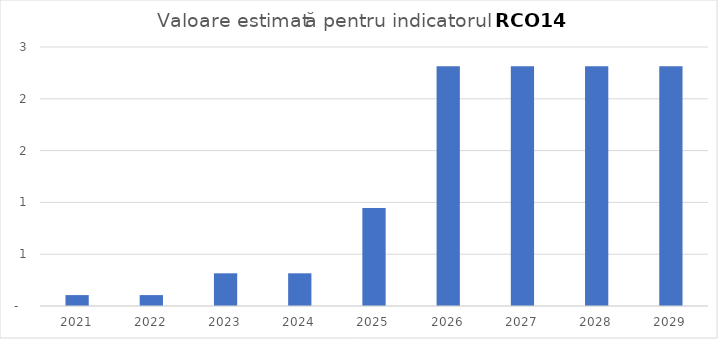
| Category | Series 0 |
|---|---|
| 2021.0 | 0.105 |
| 2022.0 | 0.105 |
| 2023.0 | 0.316 |
| 2024.0 | 0.316 |
| 2025.0 | 0.947 |
| 2026.0 | 2.314 |
| 2027.0 | 2.314 |
| 2028.0 | 2.314 |
| 2029.0 | 2.314 |